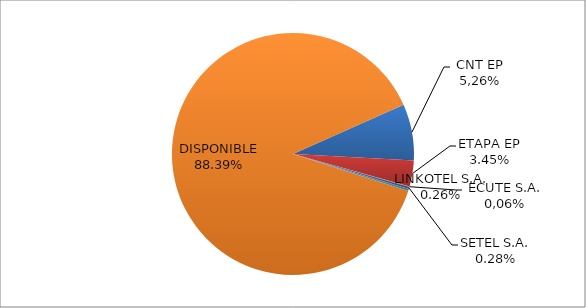
| Category | CODIGO DE AREA 7 |
|---|---|
| CORPORACIÓN NACIONAL TELECOMUNICACIONES CNT EP | 0.075 |
| ETAPA EP | 0.035 |
| CONECEL (ex ECUADORTELECOM S.A.) | 0.001 |
| SETEL S.A. | 0.003 |
| LINKOTEL S.A. | 0.003 |
| DISPONIBLE | 0.884 |